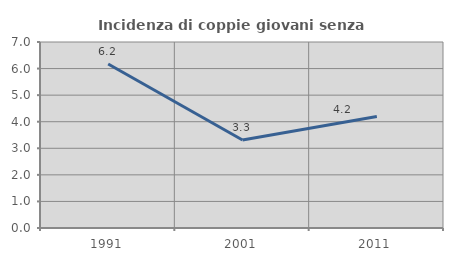
| Category | Incidenza di coppie giovani senza figli |
|---|---|
| 1991.0 | 6.173 |
| 2001.0 | 3.311 |
| 2011.0 | 4.196 |